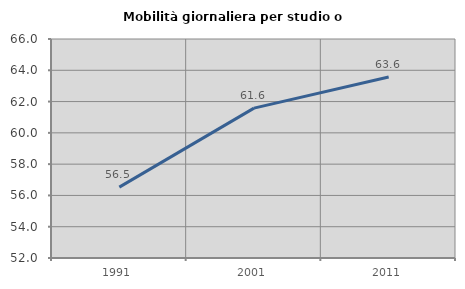
| Category | Mobilità giornaliera per studio o lavoro |
|---|---|
| 1991.0 | 56.53 |
| 2001.0 | 61.581 |
| 2011.0 | 63.569 |